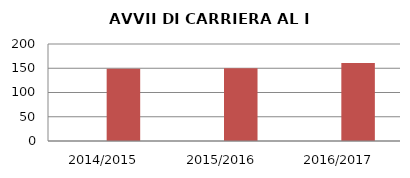
| Category | ANNO | NUMERO |
|---|---|---|
| 2014/2015 | 0 | 149 |
| 2015/2016 | 0 | 150 |
| 2016/2017 | 0 | 161 |